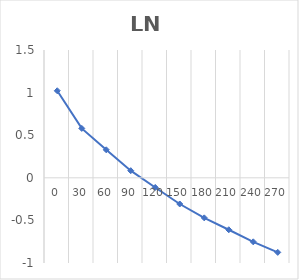
| Category | Series 0 |
|---|---|
| 0.0 | 1.022 |
| 30.0 | 0.58 |
| 60.0 | 0.329 |
| 90.0 | 0.083 |
| 120.0 | -0.113 |
| 150.0 | -0.307 |
| 180.0 | -0.47 |
| 210.0 | -0.61 |
| 240.0 | -0.751 |
| 270.0 | -0.875 |